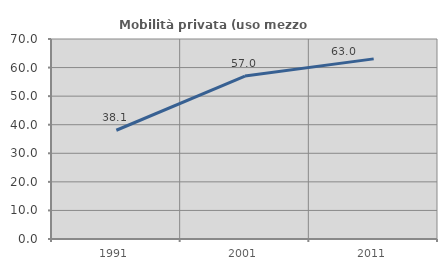
| Category | Mobilità privata (uso mezzo privato) |
|---|---|
| 1991.0 | 38.06 |
| 2001.0 | 57.044 |
| 2011.0 | 63.04 |